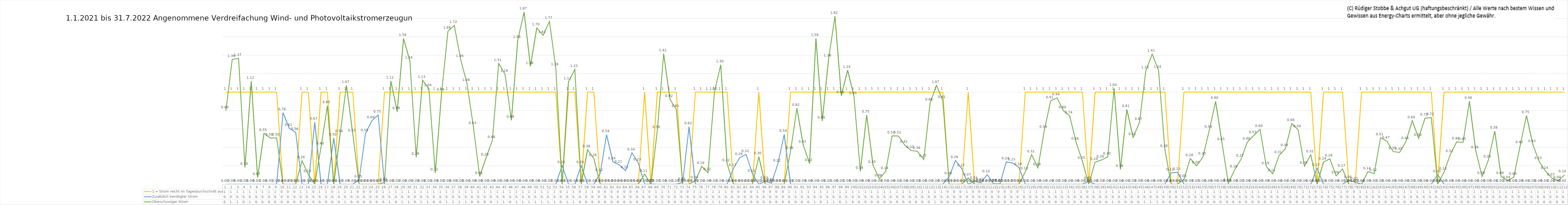
| Category | 1 = Strom reicht im Tagesdurchschnitt aus | Zusätzlich benötigter Strom | Überschüssiger Strom |
|---|---|---|---|
| 0 | 1 | 0 | 0.798 |
| 1 | 1 | 0 | 1.356 |
| 2 | 1 | 0 | 1.366 |
| 3 | 1 | 0 | 0.184 |
| 4 | 1 | 0 | 1.118 |
| 5 | 1 | 0 | 0.073 |
| 6 | 1 | 0 | 0.553 |
| 7 | 1 | 0 | 0.501 |
| 8 | 1 | 0 | 0.503 |
| 9 | 0 | 0.777 | 0 |
| 10 | 0 | 0.606 | 0 |
| 11 | 0 | 0.563 | 0 |
| 12 | 1 | 0 | 0.255 |
| 13 | 1 | 0 | 0.104 |
| 14 | 0 | 0.673 | 0 |
| 15 | 1 | 0 | 0.405 |
| 16 | 1 | 0 | 0.852 |
| 17 | 0 | 0.502 | 0 |
| 18 | 1 | 0 | 0.54 |
| 19 | 1 | 0 | 1.074 |
| 20 | 1 | 0 | 0.546 |
| 21 | 0 | 0.048 | 0 |
| 22 | 0 | 0.55 | 0 |
| 23 | 0 | 0.688 | 0 |
| 24 | 0 | 0.751 | 0 |
| 25 | 1 | 0 | 0.018 |
| 26 | 1 | 0 | 1.121 |
| 27 | 1 | 0 | 0.788 |
| 28 | 1 | 0 | 1.583 |
| 29 | 1 | 0 | 1.338 |
| 30 | 1 | 0 | 0.293 |
| 31 | 1 | 0 | 1.13 |
| 32 | 1 | 0 | 1.037 |
| 33 | 1 | 0 | 0.123 |
| 34 | 1 | 0 | 0.992 |
| 35 | 1 | 0 | 1.662 |
| 36 | 1 | 0 | 1.724 |
| 37 | 1 | 0 | 1.355 |
| 38 | 1 | 0 | 1.094 |
| 39 | 1 | 0 | 0.628 |
| 40 | 1 | 0 | 0.085 |
| 41 | 1 | 0 | 0.286 |
| 42 | 1 | 0 | 0.476 |
| 43 | 1 | 0 | 1.311 |
| 44 | 1 | 0 | 1.194 |
| 45 | 1 | 0 | 0.694 |
| 46 | 1 | 0 | 1.563 |
| 47 | 1 | 0 | 1.87 |
| 48 | 1 | 0 | 1.28 |
| 49 | 1 | 0 | 1.697 |
| 50 | 1 | 0 | 1.616 |
| 51 | 1 | 0 | 1.767 |
| 52 | 1 | 0 | 1.264 |
| 53 | 0 | 0.202 | 0 |
| 54 | 1 | 0 | 1.112 |
| 55 | 1 | 0 | 1.247 |
| 56 | 0 | 0.202 | 0 |
| 57 | 1 | 0 | 0.376 |
| 58 | 1 | 0 | 0.278 |
| 59 | 0 | 0.118 | 0 |
| 60 | 0 | 0.538 | 0 |
| 61 | 0 | 0.244 | 0 |
| 62 | 0 | 0.209 | 0 |
| 63 | 0 | 0.147 | 0 |
| 64 | 0 | 0.341 | 0 |
| 65 | 0 | 0.231 | 0 |
| 66 | 1 | 0 | 0.11 |
| 67 | 0 | 0.003 | 0 |
| 68 | 1 | 0 | 0.584 |
| 69 | 1 | 0 | 1.417 |
| 70 | 1 | 0 | 0.92 |
| 71 | 1 | 0 | 0.813 |
| 72 | 0 | 0.019 | 0 |
| 73 | 0 | 0.624 | 0 |
| 74 | 1 | 0 | 0.038 |
| 75 | 1 | 0 | 0.193 |
| 76 | 1 | 0 | 0.125 |
| 77 | 1 | 0 | 0.999 |
| 78 | 1 | 0 | 1.297 |
| 79 | 1 | 0 | 0.224 |
| 80 | 0 | 0.171 | 0 |
| 81 | 0 | 0.289 | 0 |
| 82 | 0 | 0.323 | 0 |
| 83 | 0 | 0.11 | 0 |
| 84 | 1 | 0 | 0.298 |
| 85 | 0 | 0.032 | 0 |
| 86 | 0 | 0.013 | 0 |
| 87 | 0 | 0.22 | 0 |
| 88 | 0 | 0.541 | 0 |
| 89 | 1 | 0 | 0.357 |
| 90 | 1 | 0 | 0.825 |
| 91 | 1 | 0 | 0.425 |
| 92 | 1 | 0 | 0.225 |
| 93 | 1 | 0 | 1.583 |
| 94 | 1 | 0 | 0.686 |
| 95 | 1 | 0 | 1.361 |
| 96 | 1 | 0 | 1.824 |
| 97 | 1 | 0 | 0.96 |
| 98 | 1 | 0 | 1.239 |
| 99 | 1 | 0 | 0.951 |
| 100 | 1 | 0 | 0.14 |
| 101 | 1 | 0 | 0.751 |
| 102 | 1 | 0 | 0.205 |
| 103 | 1 | 0 | 0.06 |
| 104 | 1 | 0 | 0.138 |
| 105 | 1 | 0 | 0.525 |
| 106 | 1 | 0 | 0.524 |
| 107 | 1 | 0 | 0.425 |
| 108 | 1 | 0 | 0.366 |
| 109 | 1 | 0 | 0.357 |
| 110 | 1 | 0 | 0.269 |
| 111 | 1 | 0 | 0.884 |
| 112 | 1 | 0 | 1.074 |
| 113 | 1 | 0 | 0.908 |
| 114 | 0 | 0.082 | 0 |
| 115 | 0 | 0.258 | 0 |
| 116 | 0 | 0.168 | 0 |
| 117 | 1 | 0 | 0.068 |
| 118 | 0 | 0.031 | 0 |
| 119 | 0 | 0.016 | 0 |
| 120 | 0 | 0.104 | 0 |
| 121 | 0 | 0.005 | 0 |
| 122 | 0 | 0.003 | 0 |
| 123 | 0 | 0.242 | 0 |
| 124 | 0 | 0.23 | 0 |
| 125 | 0 | 0.181 | 0 |
| 126 | 1 | 0 | 0.134 |
| 127 | 1 | 0 | 0.321 |
| 128 | 1 | 0 | 0.178 |
| 129 | 1 | 0 | 0.585 |
| 130 | 1 | 0 | 0.906 |
| 131 | 1 | 0 | 0.937 |
| 132 | 1 | 0 | 0.798 |
| 133 | 1 | 0 | 0.741 |
| 134 | 1 | 0 | 0.458 |
| 135 | 1 | 0 | 0.25 |
| 136 | 0 | 0.03 | 0 |
| 137 | 1 | 0 | 0.238 |
| 138 | 1 | 0 | 0.263 |
| 139 | 1 | 0 | 0.298 |
| 140 | 1 | 0 | 1.04 |
| 141 | 1 | 0 | 0.161 |
| 142 | 1 | 0 | 0.812 |
| 143 | 1 | 0 | 0.509 |
| 144 | 1 | 0 | 0.672 |
| 145 | 1 | 0 | 1.232 |
| 146 | 1 | 0 | 1.413 |
| 147 | 1 | 0 | 1.238 |
| 148 | 1 | 0 | 0.379 |
| 149 | 0 | 0.123 | 0 |
| 150 | 0 | 0.129 | 0 |
| 151 | 1 | 0 | 0.052 |
| 152 | 1 | 0 | 0.279 |
| 153 | 1 | 0 | 0.199 |
| 154 | 1 | 0 | 0.296 |
| 155 | 1 | 0 | 0.585 |
| 156 | 1 | 0 | 0.899 |
| 157 | 1 | 0 | 0.452 |
| 158 | 1 | 0 | 0.009 |
| 159 | 1 | 0 | 0.156 |
| 160 | 1 | 0 | 0.272 |
| 161 | 1 | 0 | 0.456 |
| 162 | 1 | 0 | 0.528 |
| 163 | 1 | 0 | 0.595 |
| 164 | 1 | 0 | 0.191 |
| 165 | 1 | 0 | 0.114 |
| 166 | 1 | 0 | 0.312 |
| 167 | 1 | 0 | 0.386 |
| 168 | 1 | 0 | 0.659 |
| 169 | 1 | 0 | 0.592 |
| 170 | 1 | 0 | 0.196 |
| 171 | 1 | 0 | 0.32 |
| 172 | 0 | 0.174 | 0 |
| 173 | 1 | 0 | 0.24 |
| 174 | 1 | 0 | 0.276 |
| 175 | 1 | 0 | 0.09 |
| 176 | 1 | 0 | 0.165 |
| 177 | 0 | 0.041 | 0 |
| 178 | 0 | 0.023 | 0 |
| 179 | 1 | 0 | 0 |
| 180 | 1 | 0 | 0.136 |
| 181 | 1 | 0 | 0.116 |
| 182 | 1 | 0 | 0.505 |
| 183 | 1 | 0 | 0.468 |
| 184 | 1 | 0 | 0.354 |
| 185 | 1 | 0 | 0.345 |
| 186 | 1 | 0 | 0.464 |
| 187 | 1 | 0 | 0.69 |
| 188 | 1 | 0 | 0.498 |
| 189 | 1 | 0 | 0.717 |
| 190 | 1 | 0 | 0.723 |
| 191 | 0 | 0.104 | 0 |
| 192 | 1 | 0 | 0.132 |
| 193 | 1 | 0 | 0.323 |
| 194 | 1 | 0 | 0.459 |
| 195 | 1 | 0 | 0.454 |
| 196 | 1 | 0 | 0.901 |
| 197 | 1 | 0 | 0.364 |
| 198 | 1 | 0 | 0.084 |
| 199 | 1 | 0 | 0.264 |
| 200 | 1 | 0 | 0.577 |
| 201 | 1 | 0 | 0.085 |
| 202 | 1 | 0 | 0.039 |
| 203 | 1 | 0 | 0.077 |
| 204 | 1 | 0 | 0.418 |
| 205 | 1 | 0 | 0.746 |
| 206 | 1 | 0 | 0.431 |
| 207 | 1 | 0 | 0.247 |
| 208 | 1 | 0 | 0.142 |
| 209 | 1 | 0 | 0.068 |
| 210 | 1 | 0 | 0.037 |
| 211 | 1 | 0 | 0.102 |